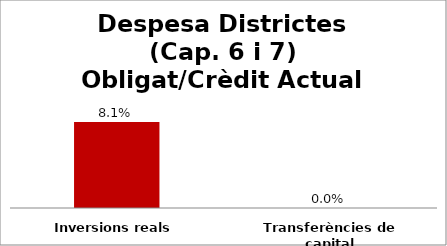
| Category | Series 0 |
|---|---|
| Inversions reals | 0.081 |
| Transferències de capital | 0 |